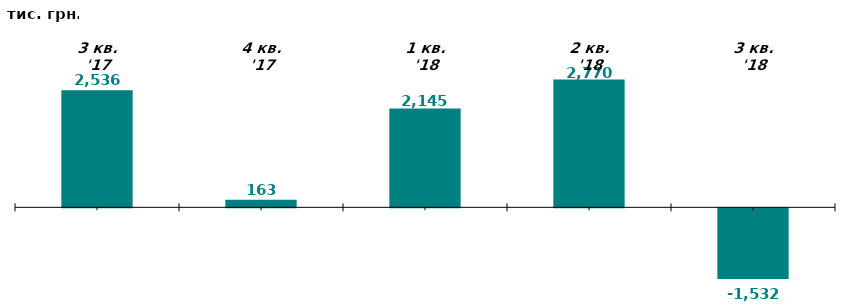
| Category | Series 1 |
|---|---|
| 3 кв. '17 | 2536.489 |
| 4 кв. '17 | 162.522 |
| 1 кв. '18 | 2145.214 |
| 2 кв. '18 | 2770.106 |
| 3 кв. '18 | -1531.644 |